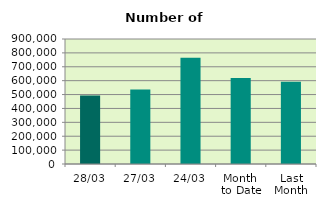
| Category | Series 0 |
|---|---|
| 28/03 | 493104 |
| 27/03 | 536418 |
| 24/03 | 764336 |
| Month 
to Date | 619737.3 |
| Last
Month | 592303 |